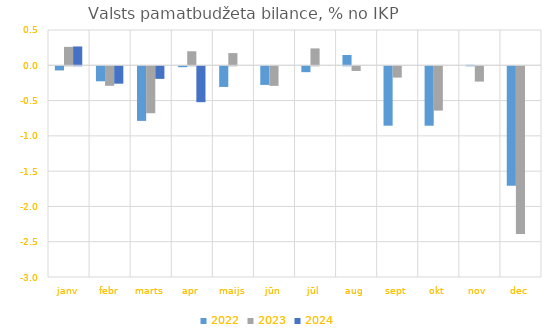
| Category | 2022 | 2023 | 2024 |
|---|---|---|---|
| janv | -0.059 | 0.261 | 0.267 |
| febr | -0.213 | -0.277 | -0.247 |
| marts | -0.774 | -0.665 | -0.178 |
| apr | -0.013 | 0.199 | -0.508 |
| maijs | -0.293 | 0.173 | 0 |
| jūn | -0.264 | -0.277 | 0 |
| jūl | -0.083 | 0.239 | 0 |
| aug | 0.146 | -0.066 | 0 |
| sept | -0.842 | -0.16 | 0 |
| okt | -0.842 | -0.628 | 0 |
| nov | 0.007 | -0.217 | 0 |
| dec | -1.692 | -2.376 | 0 |